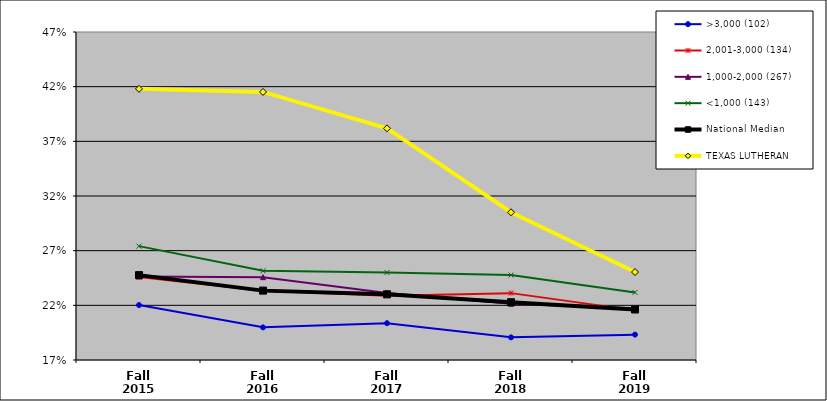
| Category | >3,000 (102) | 2,001-3,000 (134) | 1,000-2,000 (267) | <1,000 (143) | National Median | TEXAS LUTHERAN |
|---|---|---|---|---|---|---|
| Fall 2015 | 0.22 | 0.246 | 0.246 | 0.274 | 0.248 | 0.418 |
| Fall 2016 | 0.2 | 0.233 | 0.246 | 0.252 | 0.233 | 0.415 |
| Fall 2017 | 0.204 | 0.229 | 0.231 | 0.25 | 0.23 | 0.382 |
| Fall 2018 | 0.191 | 0.231 | 0.221 | 0.248 | 0.223 | 0.305 |
| Fall 2019 | 0.193 | 0.215 | 0.217 | 0.232 | 0.216 | 0.25 |